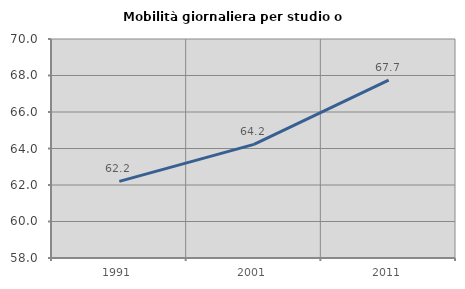
| Category | Mobilità giornaliera per studio o lavoro |
|---|---|
| 1991.0 | 62.202 |
| 2001.0 | 64.225 |
| 2011.0 | 67.746 |